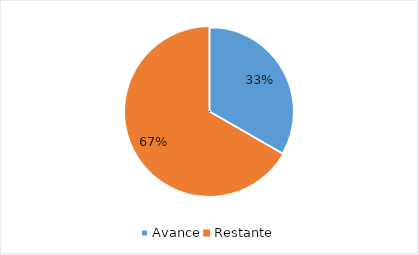
| Category | Series 0 |
|---|---|
| Avance | 0.333 |
| Restante | 0.667 |